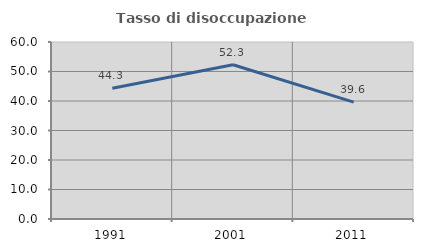
| Category | Tasso di disoccupazione giovanile  |
|---|---|
| 1991.0 | 44.304 |
| 2001.0 | 52.273 |
| 2011.0 | 39.623 |